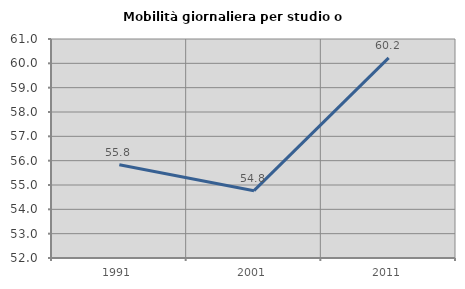
| Category | Mobilità giornaliera per studio o lavoro |
|---|---|
| 1991.0 | 55.835 |
| 2001.0 | 54.767 |
| 2011.0 | 60.223 |